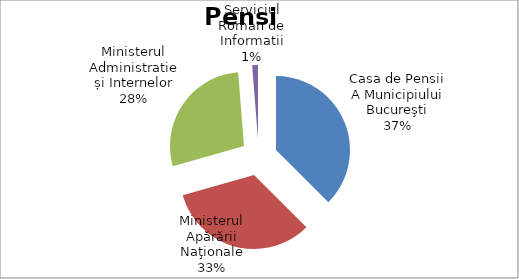
| Category | Series 0 |
|---|---|
| Casa de Pensii A Municipiului Bucureşti | 4539 |
| Ministerul Apărării Naţionale | 4013 |
| Ministerul Administratie și Internelor | 3406 |
| Serviciul Roman de Informatii | 153 |